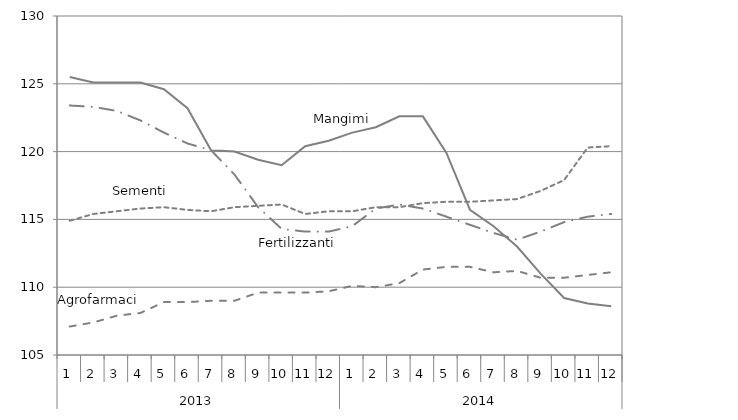
| Category | Sementi | Fertilizzanti | Agrofarmaci | Mangimi |
|---|---|---|---|---|
| 0 | 114.9 | 123.4 | 107.1 | 125.5 |
| 1 | 115.4 | 123.3 | 107.4 | 125.1 |
| 2 | 115.6 | 123 | 107.9 | 125.1 |
| 3 | 115.8 | 122.3 | 108.1 | 125.1 |
| 4 | 115.9 | 121.4 | 108.9 | 124.6 |
| 5 | 115.7 | 120.6 | 108.9 | 123.2 |
| 6 | 115.6 | 120.1 | 109 | 120.1 |
| 7 | 115.9 | 118.3 | 109 | 120 |
| 8 | 116 | 115.9 | 109.6 | 119.4 |
| 9 | 116.1 | 114.3 | 109.6 | 119 |
| 10 | 115.4 | 114.1 | 109.6 | 120.4 |
| 11 | 115.6 | 114.1 | 109.7 | 120.8 |
| 12 | 115.6 | 114.5 | 110.1 | 121.4 |
| 13 | 115.9 | 115.8 | 110 | 121.8 |
| 14 | 115.9 | 116.1 | 110.3 | 122.6 |
| 15 | 116.2 | 115.8 | 111.3 | 122.6 |
| 16 | 116.3 | 115.2 | 111.5 | 119.9 |
| 17 | 116.3 | 114.6 | 111.5 | 115.7 |
| 18 | 116.4 | 114 | 111.1 | 114.5 |
| 19 | 116.5 | 113.5 | 111.2 | 113 |
| 20 | 117.1 | 114.1 | 110.7 | 111 |
| 21 | 117.9 | 114.8 | 110.7 | 109.2 |
| 22 | 120.3 | 115.2 | 110.9 | 108.8 |
| 23 | 120.4 | 115.4 | 111.1 | 108.6 |